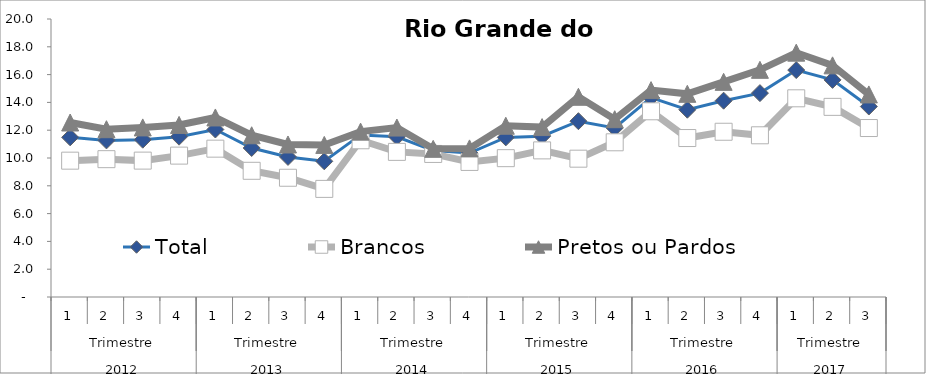
| Category | Total | Brancos | Pretos ou Pardos |
|---|---|---|---|
| 0 | 11.486 | 9.808 | 12.553 |
| 1 | 11.266 | 9.916 | 12.071 |
| 2 | 11.315 | 9.812 | 12.2 |
| 3 | 11.533 | 10.172 | 12.38 |
| 4 | 12.051 | 10.672 | 12.916 |
| 5 | 10.721 | 9.079 | 11.635 |
| 6 | 10.077 | 8.578 | 10.971 |
| 7 | 9.763 | 7.777 | 10.941 |
| 8 | 11.661 | 11.275 | 11.897 |
| 9 | 11.529 | 10.44 | 12.191 |
| 10 | 10.537 | 10.291 | 10.659 |
| 11 | 10.355 | 9.717 | 10.69 |
| 12 | 11.483 | 9.989 | 12.321 |
| 13 | 11.569 | 10.547 | 12.223 |
| 14 | 12.649 | 9.951 | 14.404 |
| 15 | 12.159 | 11.131 | 12.791 |
| 16 | 14.348 | 13.36 | 14.883 |
| 17 | 13.474 | 11.436 | 14.617 |
| 18 | 14.123 | 11.888 | 15.477 |
| 19 | 14.668 | 11.634 | 16.344 |
| 20 | 16.326 | 14.295 | 17.579 |
| 21 | 15.619 | 13.679 | 16.665 |
| 22 | 13.704 | 12.157 | 14.573 |